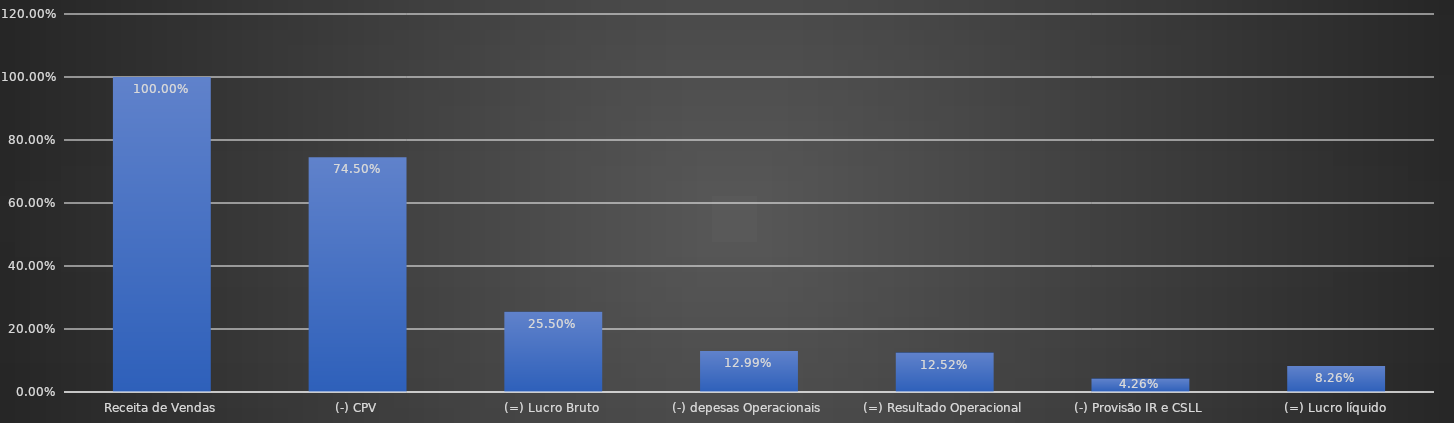
| Category | Series 0 |
|---|---|
| Receita de Vendas | 1 |
| (-) CPV | 0.745 |
| (=) Lucro Bruto | 0.255 |
| (-) depesas Operacionais | 0.13 |
| (=) Resultado Operacional | 0.125 |
| (-) Provisão IR e CSLL | 0.043 |
| (=) Lucro líquido | 0.083 |